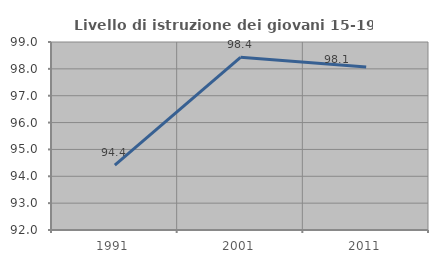
| Category | Livello di istruzione dei giovani 15-19 anni |
|---|---|
| 1991.0 | 94.415 |
| 2001.0 | 98.431 |
| 2011.0 | 98.071 |